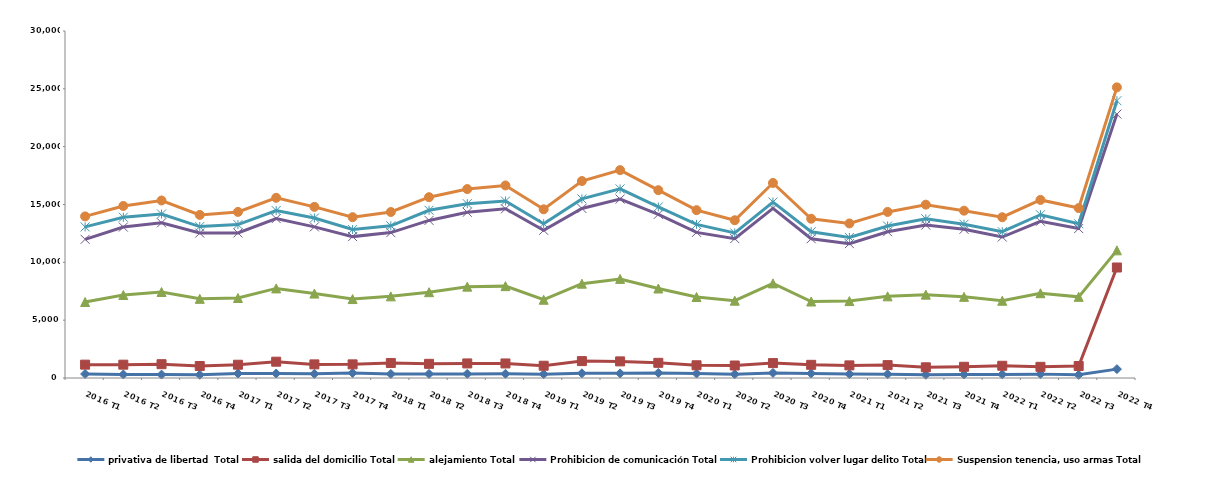
| Category | privativa de libertad  Total | salida del domicilio Total | alejamiento Total | Prohibicion de comunicación Total | Prohibicion volver lugar delito Total | Suspension tenencia, uso armas Total |
|---|---|---|---|---|---|---|
| 2016 T1 | 351 | 803 | 5416 | 5420 | 1072 | 908 |
| 2016 T2 | 306 | 846 | 6022 | 5873 | 852 | 975 |
| 2016 T3 | 295 | 898 | 6241 | 5985 | 762 | 1166 |
| 2016 T4 | 280 | 757 | 5807 | 5686 | 560 | 1010 |
| 2017 T1 | 385 | 763 | 5769 | 5625 | 720 | 1097 |
| 2017 T2 | 389 | 1020 | 6337 | 6036 | 695 | 1103 |
| 2017 T3 | 360 | 817 | 6122 | 5765 | 770 | 963 |
| 2017 T4 | 432 | 747 | 5646 | 5399 | 610 | 1069 |
| 2018 T1 | 350 | 950 | 5758 | 5513 | 585 | 1196 |
| 2018 T2 | 352 | 872 | 6194 | 6206 | 877 | 1133 |
| 2018 T3 | 354 | 906 | 6638 | 6430 | 743 | 1263 |
| 2018 T4 | 364 | 894 | 6685 | 6685 | 670 | 1349 |
| 2019 T1 | 334 | 727 | 5704 | 6003 | 573 | 1243 |
| 2019 T2 | 406 | 1055 | 6694 | 6504 | 827 | 1543 |
| 2019 T3 | 401 | 1035 | 7130 | 6902 | 880 | 1624 |
| 2019 T4 | 437 | 876 | 6426 | 6409 | 640 | 1450 |
| 2020 T1 | 387 | 713 | 5904 | 5586 | 692 | 1228 |
| 2020 T2 | 325 | 755 | 5603 | 5367 | 488 | 1099 |
| 2020 T3 | 437 | 852 | 6890 | 6487 | 545 | 1652 |
| 2020 T4 | 395 | 744 | 5474 | 5429 | 606 | 1122 |
| 2021 T1 | 336 | 755 | 5558 | 4967 | 536 | 1211 |
| 2021 T2 | 326 | 788 | 5945 | 5586 | 497 | 1215 |
| 2021 T3 | 279 | 645 | 6283 | 6015 | 538 | 1226 |
| 2021 T4 | 306 | 664 | 6045 | 5843 | 435 | 1173 |
| 2022 T1 | 313 | 744 | 5621 | 5510 | 462 | 1249 |
| 2022 T2 | 335 | 632 | 6361 | 6222 | 564 | 1282 |
| 2022 T3 | 273 | 765 | 5978 | 5905 | 411 | 1359 |
| 2022 T4 | 766 | 8787 | 1484 | 11779 | 1157 | 1154 |